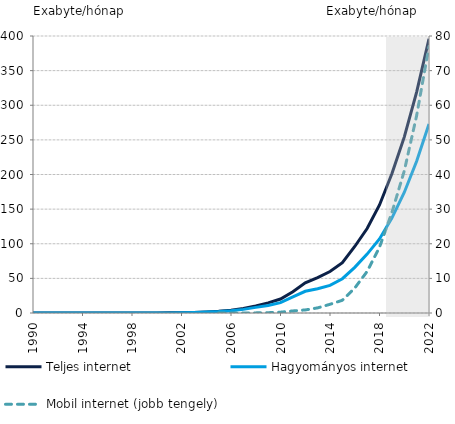
| Category | Teljes internet  | Hagyományos internet  |
|---|---|---|
| 1990-01-01 | 0 | 0 |
| 1991-01-01 | 0 | 0 |
| 1992-01-01 | 0 | 0 |
| 1993-01-01 | 0 | 0 |
| 1994-01-01 | 0 | 0 |
| 1995-01-01 | 0 | 0 |
| 1996-01-01 | 0.002 | 0.002 |
| 1997-01-01 | 0.005 | 0.005 |
| 1998-01-01 | 0.012 | 0.011 |
| 1999-01-01 | 0.028 | 0.026 |
| 2000-01-01 | 0.084 | 0.075 |
| 2001-01-01 | 0.197 | 0.175 |
| 2002-01-01 | 0.405 | 0.356 |
| 2003-01-01 | 0.784 | 0.681 |
| 2004-01-01 | 1.477 | 1.267 |
| 2005-01-01 | 2.426 | 2.055 |
| 2006-01-01 | 3.992 | 3.339 |
| 2007-01-01 | 6.43 | 5.219 |
| 2008-01-01 | 10.174 | 8.14 |
| 2009-01-01 | 14.686 | 10.942 |
| 2010-01-01 | 20.151 | 14.955 |
| 2011-01-01 | 30.734 | 23.288 |
| 2012-01-01 | 43.57 | 31.339 |
| 2013-01-01 | 51.168 | 34.952 |
| 2014-01-01 | 59.848 | 39.909 |
| 2015-01-01 | 72.521 | 49.494 |
| 2016-01-01 | 96.054 | 65.942 |
| 2017-01-01 | 122 | 85 |
| 2018-01-01 | 156 | 107 |
| 2019-01-01 | 201 | 137 |
| 2020-01-01 | 254 | 174 |
| 2021-01-01 | 319 | 219 |
| 2022-01-01 | 396 | 273 |